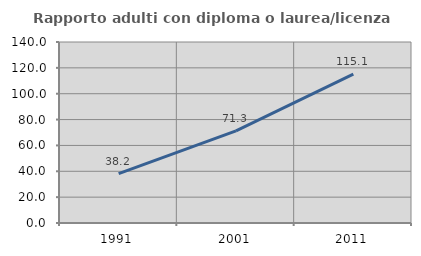
| Category | Rapporto adulti con diploma o laurea/licenza media  |
|---|---|
| 1991.0 | 38.208 |
| 2001.0 | 71.269 |
| 2011.0 | 115.111 |